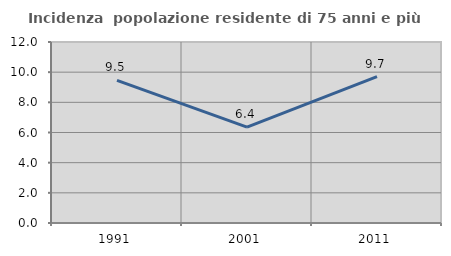
| Category | Incidenza  popolazione residente di 75 anni e più |
|---|---|
| 1991.0 | 9.456 |
| 2001.0 | 6.353 |
| 2011.0 | 9.701 |